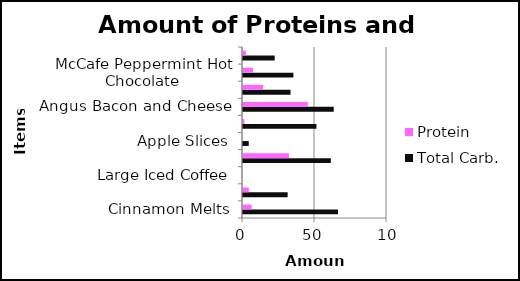
| Category | Total Carb. | Protein |
|---|---|---|
| Cinnamon Melts | 66 | 6 |
| Fruit and Walnuts | 31 | 4 |
| Large Iced Coffee | 0 | 0 |
| Premium Crispy Chicken CBO Sandwich | 61 | 32 |
| Apple Slices | 4 | 0 |
| McCafe Frozen Strawberry Lemonade | 51 | 1 |
| Angus Bacon and Cheese | 63 | 45 |
| Honey Mustard Snack Wrap | 33 | 14 |
| McCafe Peppermint Hot Chocolate | 35 | 7 |
| Soft Baked Oatmeal Raisin Cookie | 22 | 2 |